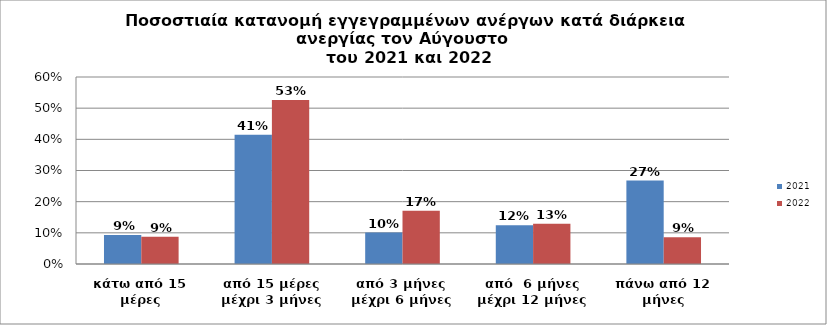
| Category | 2021 | 2022 |
|---|---|---|
| κάτω από 15 μέρες | 0.093 | 0.088 |
| από 15 μέρες μέχρι 3 μήνες | 0.414 | 0.526 |
| από 3 μήνες μέχρι 6 μήνες | 0.101 | 0.171 |
| από  6 μήνες μέχρι 12 μήνες | 0.124 | 0.129 |
| πάνω από 12 μήνες | 0.268 | 0.086 |